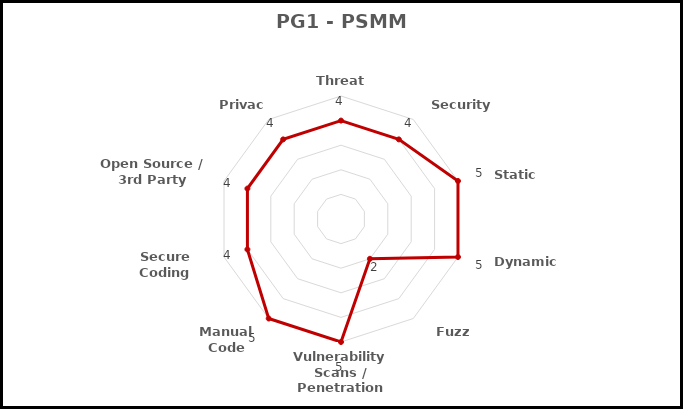
| Category | Technical Parameters |
|---|---|
| Threat Modeling | 4 |
| Security Testing | 4 |
| Static Analysis | 5 |
| Dynamic Analysis | 5 |
| Fuzz Testing | 2 |
| Vulnerability Scans / Penetration Testing | 5 |
| Manual Code Reviews | 5 |
| Secure Coding Standards | 4 |
| Open Source / 3rd Party Libraries | 4 |
| Privacy | 4 |